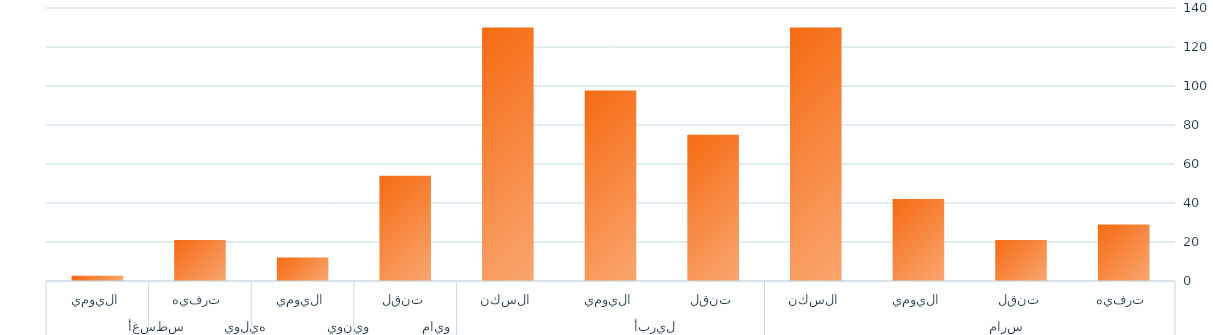
| Category | الإجمالي |
|---|---|
| 0 | 29 |
| 1 | 21 |
| 2 | 42 |
| 3 | 130 |
| 4 | 75 |
| 5 | 97.75 |
| 6 | 130 |
| 7 | 54 |
| 8 | 12 |
| 9 | 21 |
| 10 | 2.75 |